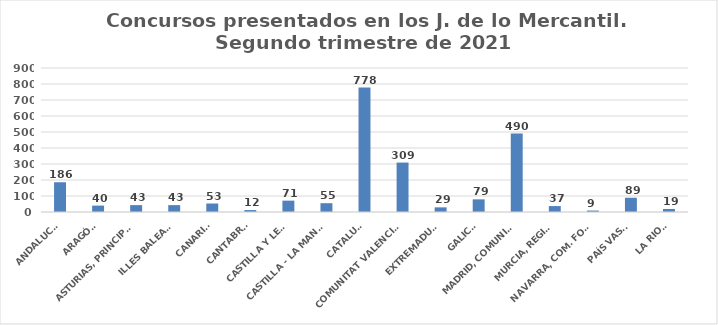
| Category | Series 0 |
|---|---|
| ANDALUCÍA | 186 |
| ARAGÓN | 40 |
| ASTURIAS, PRINCIPADO | 43 |
| ILLES BALEARS | 43 |
| CANARIAS | 53 |
| CANTABRIA | 12 |
| CASTILLA Y LEÓN | 71 |
| CASTILLA - LA MANCHA | 55 |
| CATALUÑA | 778 |
| COMUNITAT VALENCIANA | 309 |
| EXTREMADURA | 29 |
| GALICIA | 79 |
| MADRID, COMUNIDAD | 490 |
| MURCIA, REGIÓN | 37 |
| NAVARRA, COM. FORAL | 9 |
| PAÍS VASCO | 89 |
| LA RIOJA | 19 |